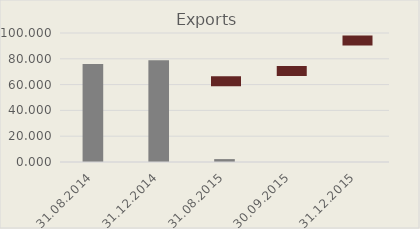
| Category | Exports |
|---|---|
| 31.08.2014 | 76.044 |
| 31.12.2014 | 78.792 |
| 31.08.2015 | 2.252 |
| 30.09.2015 | 0 |
| 31.12.2015 | 0 |